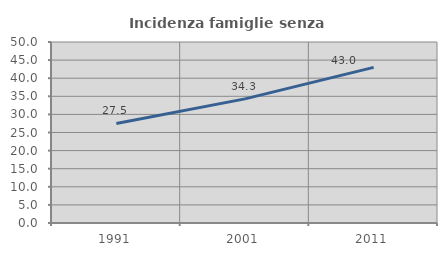
| Category | Incidenza famiglie senza nuclei |
|---|---|
| 1991.0 | 27.509 |
| 2001.0 | 34.286 |
| 2011.0 | 42.995 |